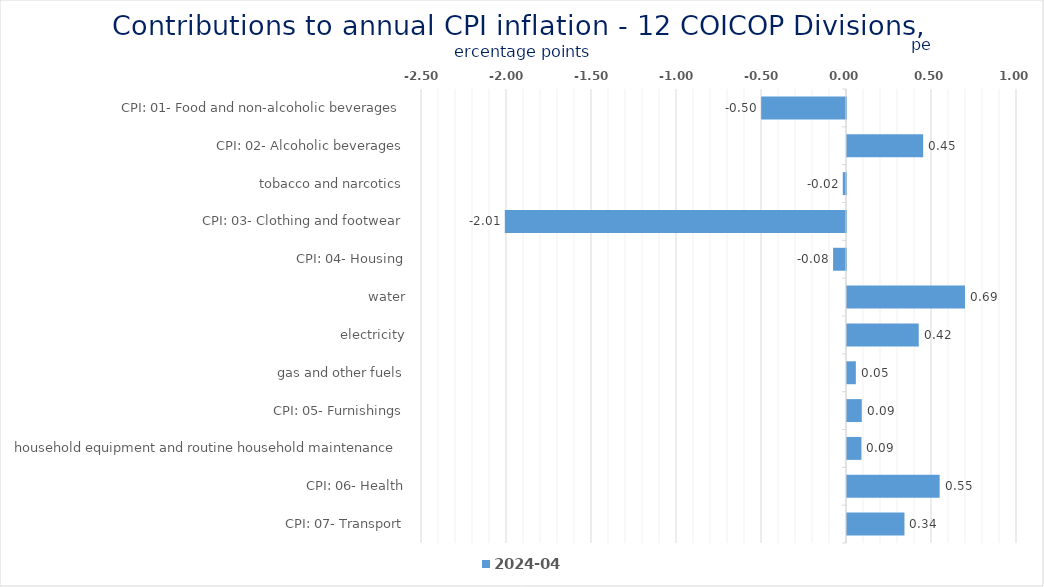
| Category | 2024-04 |
|---|---|
| CPI: 01- Food and non-alcoholic beverages | -0.499 |
| CPI: 02- Alcoholic beverages, tobacco and narcotics | 0.448 |
| CPI: 03- Clothing and footwear | -0.019 |
| CPI: 04- Housing, water, electricity, gas and other fuels | -2.007 |
| CPI: 05- Furnishings, household equipment and routine household maintenance | -0.076 |
| CPI: 06- Health | 0.694 |
| CPI: 07- Transport | 0.422 |
| CPI: 08- Communication | 0.052 |
| CPI: 09- Recreation and culture | 0.087 |
| CPI: 10- Education | 0.085 |
| CPI: 11- Restaurants and hotels | 0.545 |
| CPI: 12- Miscellaneous goods and services | 0.338 |